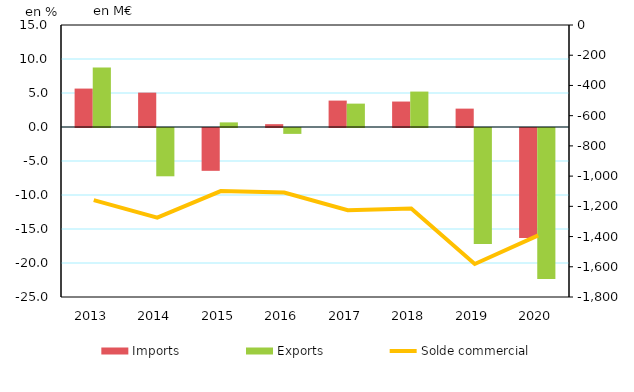
| Category | Imports | Exports |
|---|---|---|
| 2013.0 | 5.651 | 8.735 |
| 2014.0 | 5.059 | -7.102 |
| 2015.0 | -6.298 | 0.679 |
| 2016.0 | 0.416 | -0.866 |
| 2017.0 | 3.884 | 3.438 |
| 2018.0 | 3.743 | 5.21 |
| 2019.0 | 2.702 | -17.059 |
| 2020.0 | -16.167 | -22.216 |